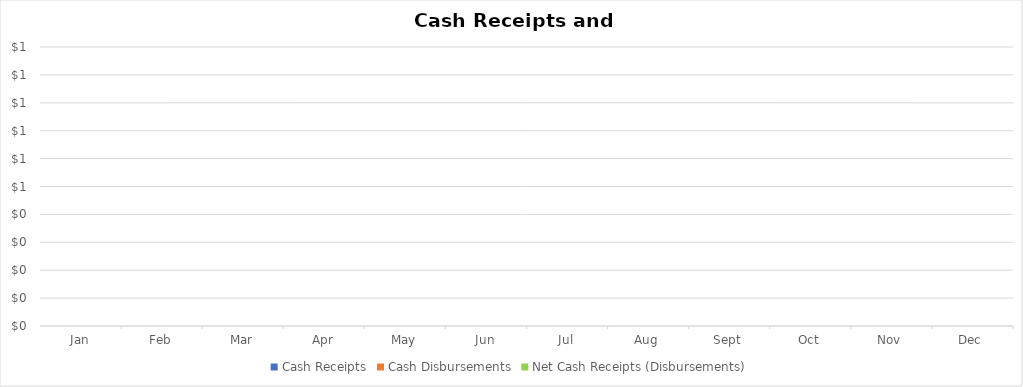
| Category | Cash Receipts | Cash Disbursements | Net Cash Receipts (Disbursements) |
|---|---|---|---|
| 2021-01-01 | 0 | 0 | 0 |
| 2021-02-01 | 0 | 0 | 0 |
| 2021-03-01 | 0 | 0 | 0 |
| 2021-04-01 | 0 | 0 | 0 |
| 2021-05-01 | 0 | 0 | 0 |
| 2021-06-01 | 0 | 0 | 0 |
| 2021-07-01 | 0 | 0 | 0 |
| 2021-08-01 | 0 | 0 | 0 |
| 2021-09-01 | 0 | 0 | 0 |
| 2021-10-01 | 0 | 0 | 0 |
| 2021-11-01 | 0 | 0 | 0 |
| 2021-12-01 | 0 | 0 | 0 |